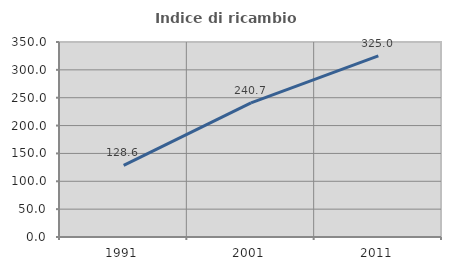
| Category | Indice di ricambio occupazionale  |
|---|---|
| 1991.0 | 128.571 |
| 2001.0 | 240.741 |
| 2011.0 | 325 |